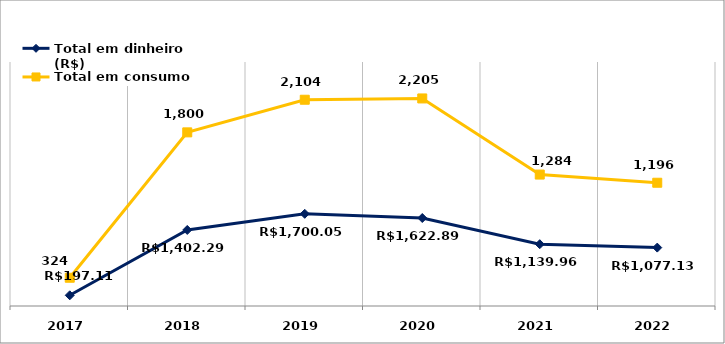
| Category | Total em dinheiro (R$) | Total em consumo (kWh) |
|---|---|---|
| 2017.0 | 197.11 | 324 |
| 2018.0 | 1402.29 | 1800 |
| 2019.0 | 1700.05 | 2104 |
| 2020.0 | 1622.89 | 2205 |
| 2021.0 | 1139.96 | 1284 |
| 2022.0 | 1077.13 | 1196 |